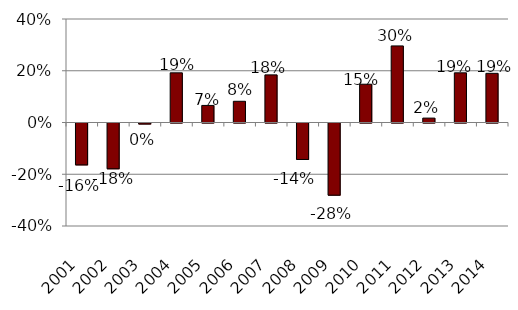
| Category | Series 0 |
|---|---|
| 2001.0 | -0.162 |
| 2002.0 | -0.177 |
| 2003.0 | -0.004 |
| 2004.0 | 0.192 |
| 2005.0 | 0.066 |
| 2006.0 | 0.082 |
| 2007.0 | 0.184 |
| 2008.0 | -0.141 |
| 2009.0 | -0.279 |
| 2010.0 | 0.148 |
| 2011.0 | 0.296 |
| 2012.0 | 0.017 |
| 2013.0 | 0.192 |
| 2014.0 | 0.19 |